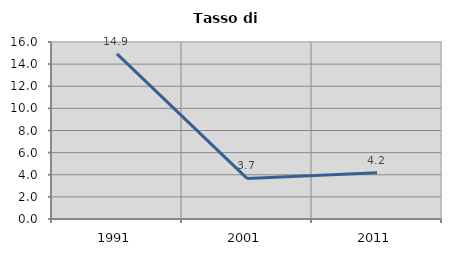
| Category | Tasso di disoccupazione   |
|---|---|
| 1991.0 | 14.933 |
| 2001.0 | 3.667 |
| 2011.0 | 4.187 |